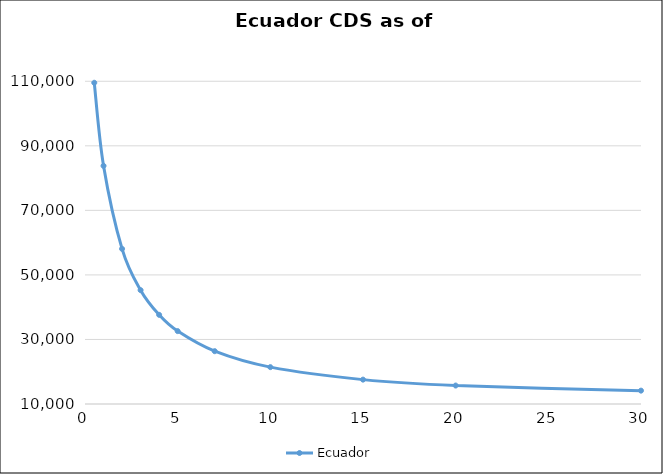
| Category | Ecuador |
|---|---|
| 0.5 | 109540.19 |
| 1.0 | 83795.85 |
| 2.0 | 58073.22 |
| 3.0 | 45278.11 |
| 4.0 | 37629.47 |
| 5.0 | 32584.32 |
| 7.0 | 26363.38 |
| 10.0 | 21422.14 |
| 15.0 | 17551.38 |
| 20.0 | 15719.07 |
| 30.0 | 14139.16 |